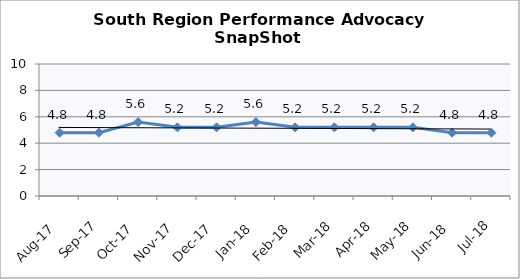
| Category | South Region |
|---|---|
| Aug-17 | 4.8 |
| Sep-17 | 4.8 |
| Oct-17 | 5.6 |
| Nov-17 | 5.2 |
| Dec-17 | 5.2 |
| Jan-18 | 5.6 |
| Feb-18 | 5.2 |
| Mar-18 | 5.2 |
| Apr-18 | 5.2 |
| May-18 | 5.2 |
| Jun-18 | 4.8 |
| Jul-18 | 4.8 |